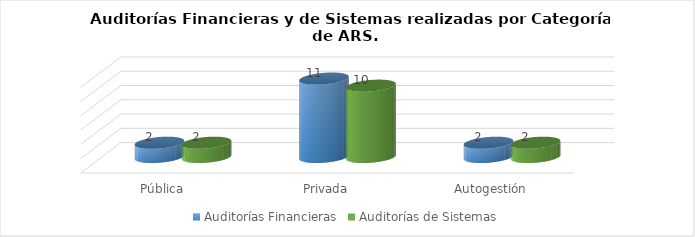
| Category | Auditorías Financieras | Auditorías de Sistemas |
|---|---|---|
| Pública | 2 | 2 |
| Privada | 11 | 10 |
| Autogestión | 2 | 2 |